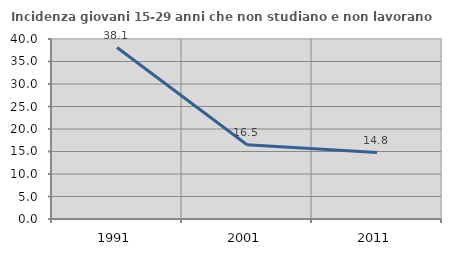
| Category | Incidenza giovani 15-29 anni che non studiano e non lavorano  |
|---|---|
| 1991.0 | 38.095 |
| 2001.0 | 16.505 |
| 2011.0 | 14.773 |